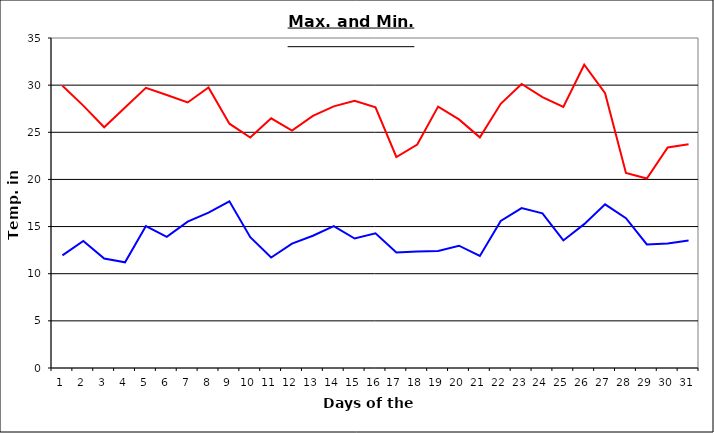
| Category | Series 0 | Series 1 |
|---|---|---|
| 0 | 29.94 | 11.95 |
| 1 | 27.83 | 13.48 |
| 2 | 25.53 | 11.61 |
| 3 | 27.62 | 11.21 |
| 4 | 29.72 | 15.05 |
| 5 | 28.95 | 13.91 |
| 6 | 28.16 | 15.53 |
| 7 | 29.76 | 16.48 |
| 8 | 25.91 | 17.68 |
| 9 | 24.45 | 13.88 |
| 10 | 26.48 | 11.72 |
| 11 | 25.18 | 13.19 |
| 12 | 26.74 | 14.03 |
| 13 | 27.75 | 15.05 |
| 14 | 28.35 | 13.73 |
| 15 | 27.65 | 14.28 |
| 16 | 22.38 | 12.25 |
| 17 | 23.7 | 12.36 |
| 18 | 27.72 | 12.41 |
| 19 | 26.37 | 12.97 |
| 20 | 24.46 | 11.88 |
| 21 | 28.02 | 15.59 |
| 22 | 30.13 | 16.96 |
| 23 | 28.73 | 16.41 |
| 24 | 27.68 | 13.53 |
| 25 | 32.17 | 15.26 |
| 26 | 29.14 | 17.36 |
| 27 | 20.69 | 15.89 |
| 28 | 20.1 | 13.1 |
| 29 | 23.39 | 13.2 |
| 30 | 23.73 | 13.52 |